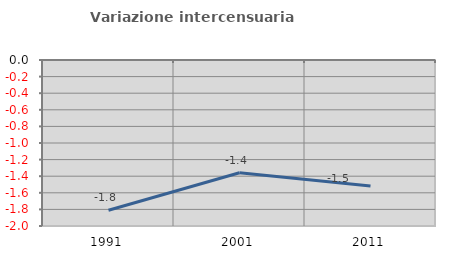
| Category | Variazione intercensuaria annua |
|---|---|
| 1991.0 | -1.81 |
| 2001.0 | -1.359 |
| 2011.0 | -1.518 |